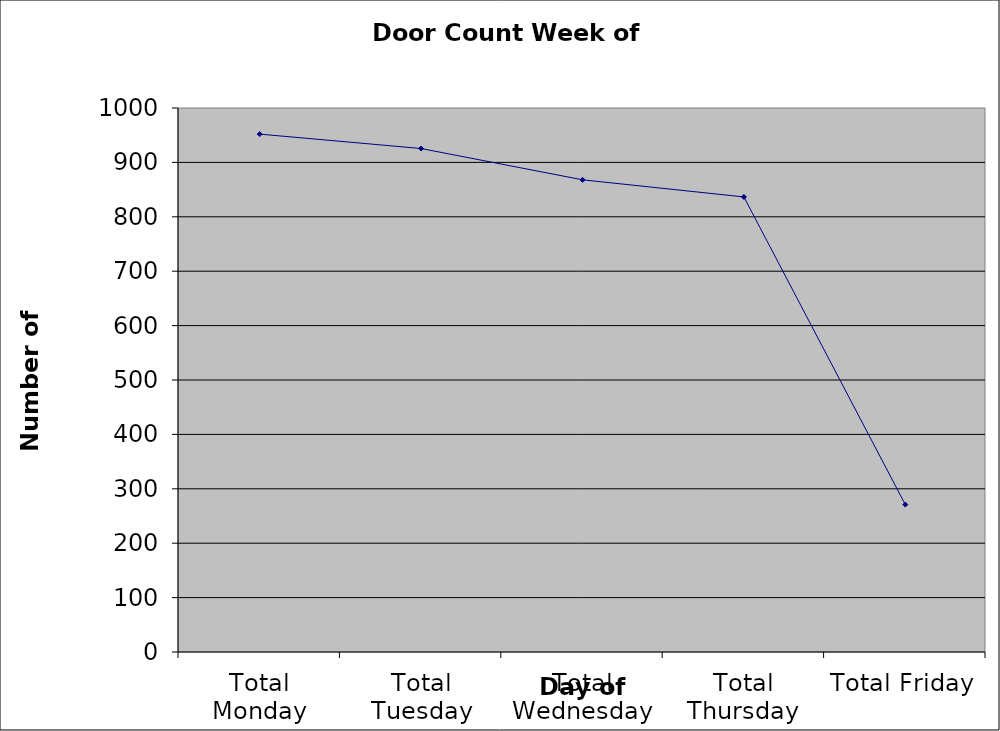
| Category | Series 0 |
|---|---|
| Total Monday | 952 |
| Total Tuesday | 925.5 |
| Total Wednesday | 868 |
| Total Thursday | 836.5 |
| Total Friday | 271 |